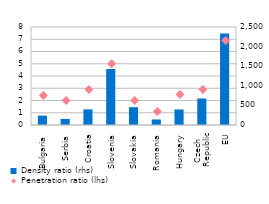
| Category | Density ratio (rhs) |
|---|---|
| Bulgaria | 239 |
| Serbia | 155 |
| Croatia | 398 |
| Slovenia | 1429 |
| Slovakia | 454 |
| Romania | 141 |
| Hungary | 396 |
| Czech 
Republic | 676 |
| ЕU | 2335 |